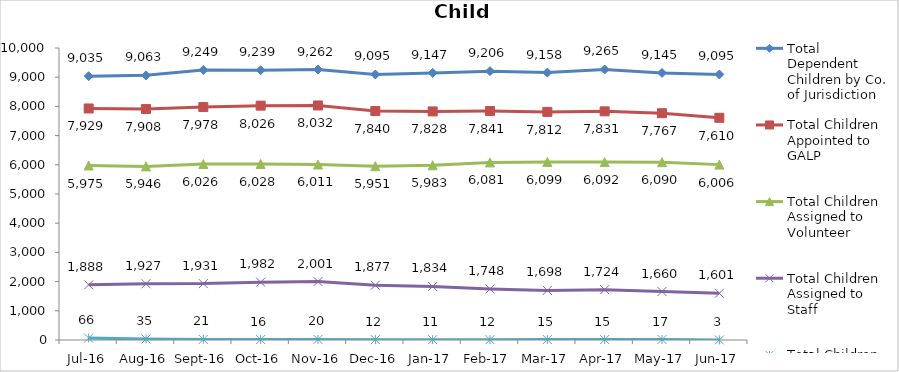
| Category | Total Dependent Children by Co. of Jurisdiction | Total Children Appointed to GALP | Total Children Assigned to Volunteer | Total Children Assigned to Staff | Total Children Unassigned |
|---|---|---|---|---|---|
| Jul-16 | 9035 | 7929 | 5975 | 1888 | 66 |
| Aug-16 | 9063 | 7908 | 5946 | 1927 | 35 |
| Sep-16 | 9249 | 7978 | 6026 | 1931 | 21 |
| Oct-16 | 9239 | 8026 | 6028 | 1982 | 16 |
| Nov-16 | 9262 | 8032 | 6011 | 2001 | 20 |
| Dec-16 | 9095 | 7840 | 5951 | 1877 | 12 |
| Jan-17 | 9147 | 7828 | 5983 | 1834 | 11 |
| Feb-17 | 9206 | 7841 | 6081 | 1748 | 12 |
| Mar-17 | 9158 | 7812 | 6099 | 1698 | 15 |
| Apr-17 | 9265 | 7831 | 6092 | 1724 | 15 |
| May-17 | 9145 | 7767 | 6090 | 1660 | 17 |
| Jun-17 | 9095 | 7610 | 6006 | 1601 | 3 |